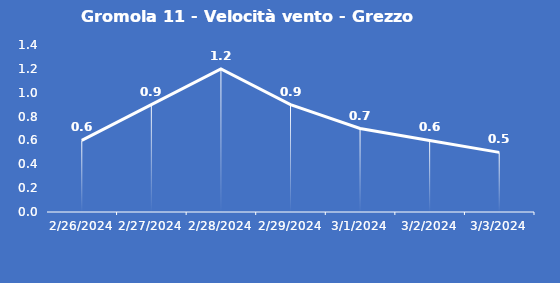
| Category | Gromola 11 - Velocità vento - Grezzo (m/s) |
|---|---|
| 2/26/24 | 0.6 |
| 2/27/24 | 0.9 |
| 2/28/24 | 1.2 |
| 2/29/24 | 0.9 |
| 3/1/24 | 0.7 |
| 3/2/24 | 0.6 |
| 3/3/24 | 0.5 |